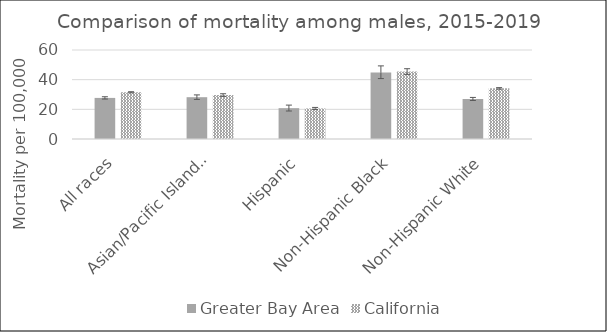
| Category | Greater Bay Area | California | US Mortality |
|---|---|---|---|
| All races | 27.7 | 31.51 |  |
| Asian/Pacific Islander | 28.19 | 29.61 |  |
| Hispanic | 20.8 | 20.59 |  |
| Non-Hispanic Black | 44.86 | 45.44 |  |
| Non-Hispanic White | 26.98 | 34.13 |  |